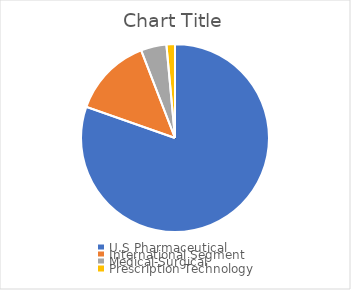
| Category | Series 0 |
|---|---|
| U.S Pharmaceutical | 212149 |
| International Segment | 36345 |
| Medical-Surgical | 11608 |
| Prescription Technology  | 3864 |